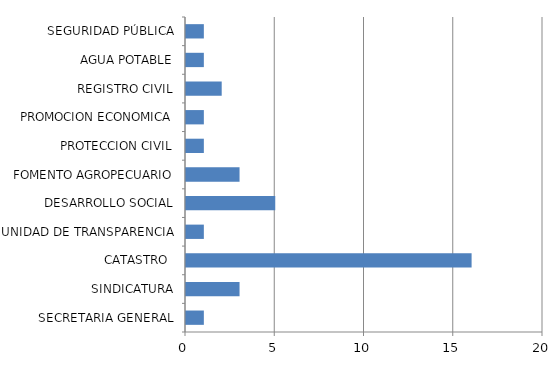
| Category | Series 0 |
|---|---|
| SECRETARIA GENERAL | 1 |
| SINDICATURA | 3 |
| CATASTRO  | 16 |
| UNIDAD DE TRANSPARENCIA | 1 |
| DESARROLLO SOCIAL | 5 |
| FOMENTO AGROPECUARIO | 3 |
| PROTECCION CIVIL | 1 |
| PROMOCION ECONOMICA | 1 |
| REGISTRO CIVIL | 2 |
| AGUA POTABLE | 1 |
| SEGURIDAD PÚBLICA | 1 |